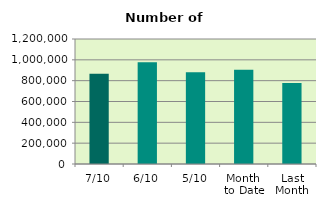
| Category | Series 0 |
|---|---|
| 7/10 | 867078 |
| 6/10 | 975944 |
| 5/10 | 881272 |
| Month 
to Date | 904317.6 |
| Last
Month | 778605.273 |